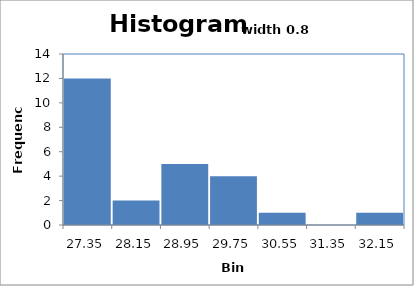
| Category | Series 0 |
|---|---|
| 27.35 | 12 |
| 28.15 | 2 |
| 28.95 | 5 |
| 29.75 | 4 |
| 30.55 | 1 |
| 31.35 | 0 |
| 32.15 | 1 |